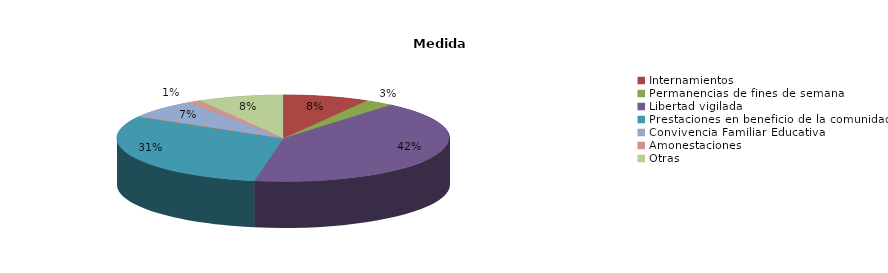
| Category | Series 0 |
|---|---|
| Expedientes de ejecución | 0 |
| Internamientos | 6 |
| Permanencias de fines de semana | 2 |
| Libertad vigilada | 30 |
| Prestaciones en beneficio de la comunidad | 22 |
| Privación de permisos y licencias | 0 |
| Convivencia Familiar Educativa | 5 |
| Amonestaciones | 1 |
| Otras | 6 |